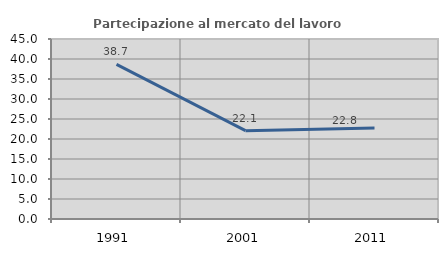
| Category | Partecipazione al mercato del lavoro  femminile |
|---|---|
| 1991.0 | 38.671 |
| 2001.0 | 22.078 |
| 2011.0 | 22.764 |